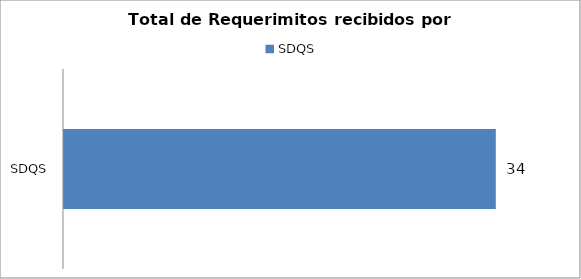
| Category | Total |
|---|---|
| SDQS | 34 |